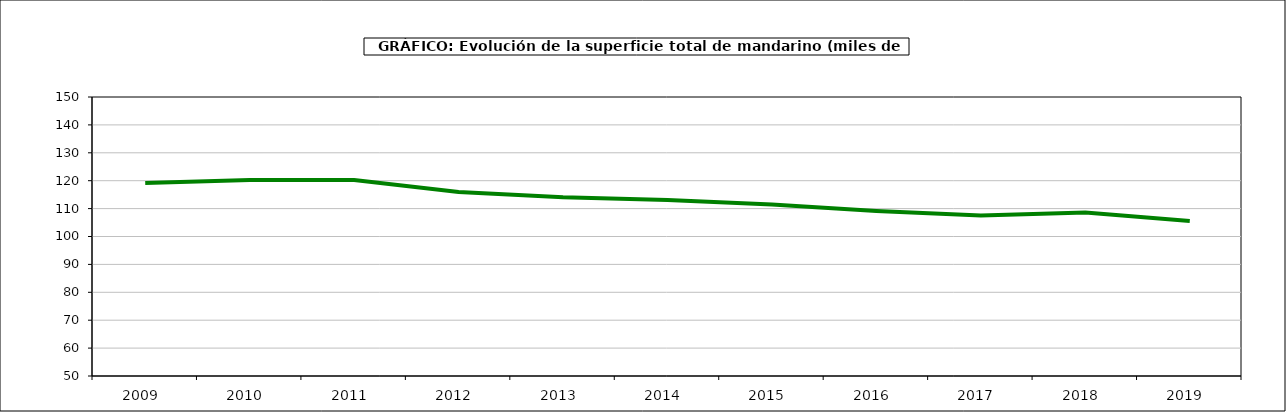
| Category | superficie |
|---|---|
| 2009.0 | 119.154 |
| 2010.0 | 120.256 |
| 2011.0 | 120.212 |
| 2012.0 | 115.927 |
| 2013.0 | 114.076 |
| 2014.0 | 113.102 |
| 2015.0 | 111.467 |
| 2016.0 | 109.127 |
| 2017.0 | 107.515 |
| 2018.0 | 108.613 |
| 2019.0 | 105.583 |